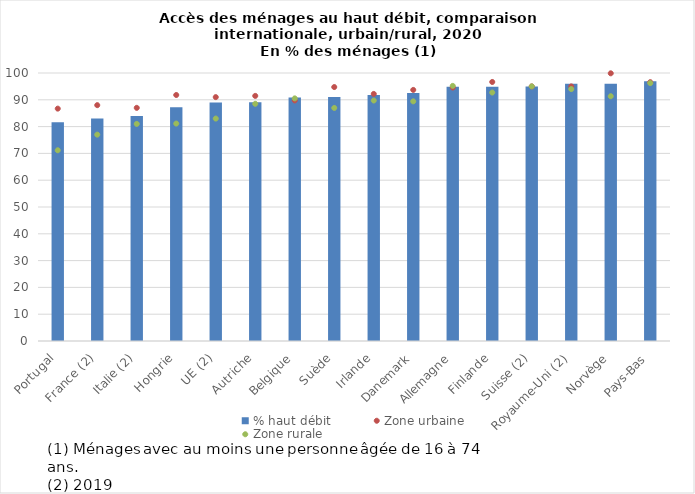
| Category | % haut débit |
|---|---|
| Portugal | 81.666 |
| France (2) | 83 |
| Italie (2) | 84 |
| Hongrie | 87.231 |
| UE (2) | 89 |
| Autriche | 89.105 |
| Belgique | 90.861 |
| Suède | 91 |
| Irlande | 91.823 |
| Danemark | 92.501 |
| Allemagne | 94.827 |
| Finlande | 94.827 |
| Suisse (2) | 95 |
| Royaume-Uni (2) | 96 |
| Norvège | 96.008 |
| Pays-Bas | 96.953 |